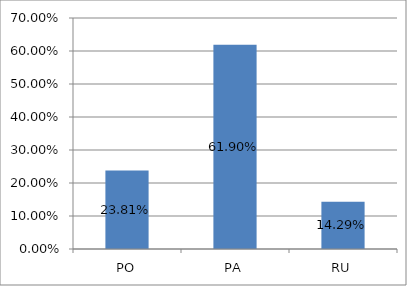
| Category | Series 0 |
|---|---|
| PO | 0.238 |
| PA | 0.619 |
| RU | 0.143 |